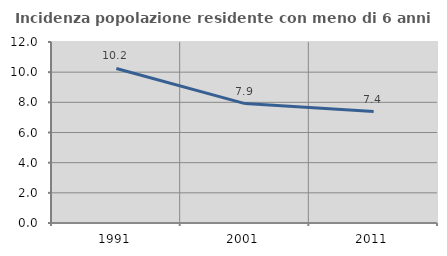
| Category | Incidenza popolazione residente con meno di 6 anni |
|---|---|
| 1991.0 | 10.243 |
| 2001.0 | 7.917 |
| 2011.0 | 7.389 |